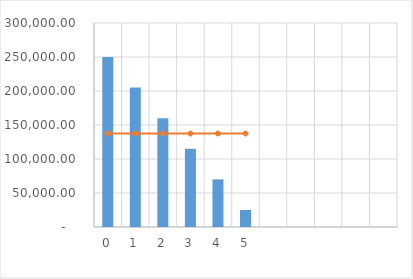
| Category | Series 0 |
|---|---|
| 0 | 250000 |
| 1 | 205000 |
| 2 | 160000 |
| 3 | 115000 |
| 4 | 70000 |
| 5 | 25000 |